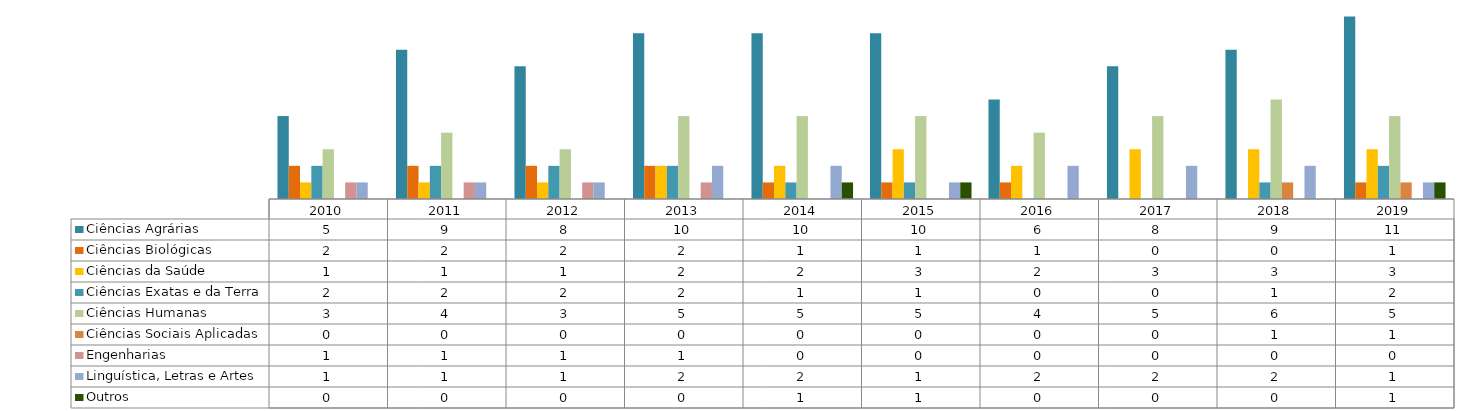
| Category | Ciências Agrárias  | Ciências Biológicas  | Ciências da Saúde  | Ciências Exatas e da Terra  | Ciências Humanas  | Ciências Sociais Aplicadas  | Engenharias  | Linguística, Letras e Artes  | Outros |
|---|---|---|---|---|---|---|---|---|---|
| 2010.0 | 5 | 2 | 1 | 2 | 3 | 0 | 1 | 1 | 0 |
| 2011.0 | 9 | 2 | 1 | 2 | 4 | 0 | 1 | 1 | 0 |
| 2012.0 | 8 | 2 | 1 | 2 | 3 | 0 | 1 | 1 | 0 |
| 2013.0 | 10 | 2 | 2 | 2 | 5 | 0 | 1 | 2 | 0 |
| 2014.0 | 10 | 1 | 2 | 1 | 5 | 0 | 0 | 2 | 1 |
| 2015.0 | 10 | 1 | 3 | 1 | 5 | 0 | 0 | 1 | 1 |
| 2016.0 | 6 | 1 | 2 | 0 | 4 | 0 | 0 | 2 | 0 |
| 2017.0 | 8 | 0 | 3 | 0 | 5 | 0 | 0 | 2 | 0 |
| 2018.0 | 9 | 0 | 3 | 1 | 6 | 1 | 0 | 2 | 0 |
| 2019.0 | 11 | 1 | 3 | 2 | 5 | 1 | 0 | 1 | 1 |